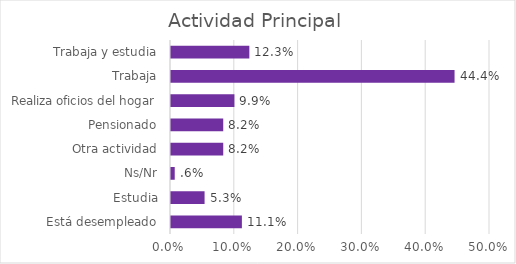
| Category | % del N de columna |
|---|---|
| Está desempleado | 0.111 |
| Estudia | 0.053 |
| Ns/Nr | 0.006 |
| Otra actividad | 0.082 |
| Pensionado | 0.082 |
| Realiza oficios del hogar | 0.099 |
| Trabaja | 0.444 |
| Trabaja y estudia | 0.123 |